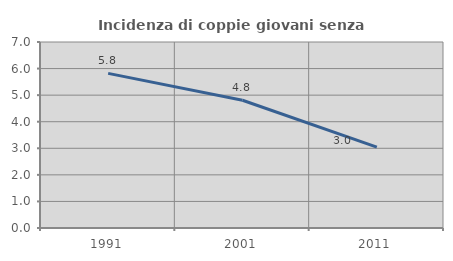
| Category | Incidenza di coppie giovani senza figli |
|---|---|
| 1991.0 | 5.819 |
| 2001.0 | 4.808 |
| 2011.0 | 3.044 |